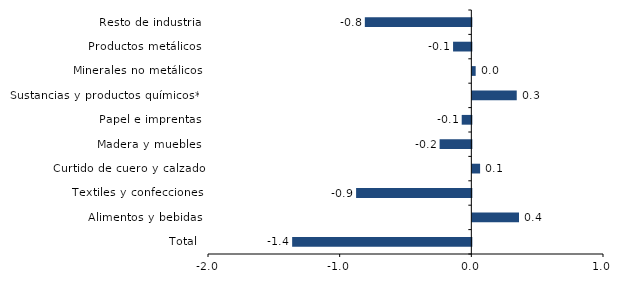
| Category | Series 0 |
|---|---|
| Total | -1.361 |
| Alimentos y bebidas | 0.354 |
| Textiles y confecciones | -0.875 |
| Curtido de cuero y calzado | 0.059 |
| Madera y muebles | -0.241 |
| Papel e imprentas | -0.073 |
| Sustancias y productos químicos** | 0.337 |
| Minerales no metálicos | 0.025 |
| Productos metálicos | -0.139 |
| Resto de industria | -0.809 |